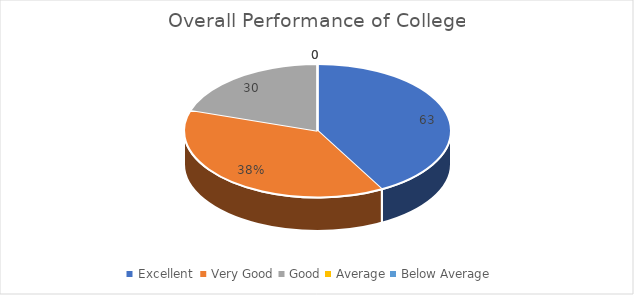
| Category | Series 0 |
|---|---|
| Excellent  | 63 |
| Very Good | 57 |
| Good | 30 |
| Average | 0 |
| Below Average | 0 |